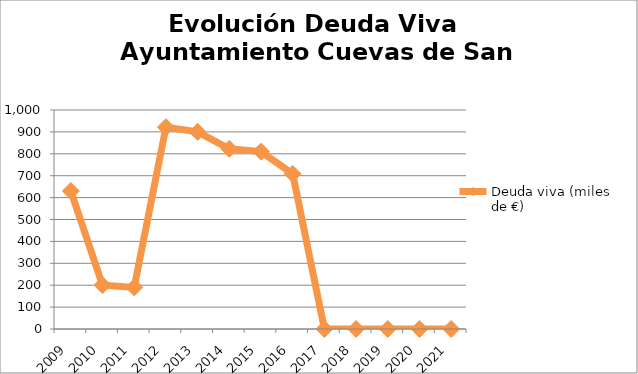
| Category | Deuda viva (miles de €) |
|---|---|
| 2009.0 | 630 |
| 2010.0 | 200 |
| 2011.0 | 190 |
| 2012.0 | 921.54 |
| 2013.0 | 900.247 |
| 2014.0 | 823.001 |
| 2015.0 | 810 |
| 2016.0 | 708.218 |
| 2017.0 | 0 |
| 2018.0 | 0 |
| 2019.0 | 0 |
| 2020.0 | 0 |
| 2021.0 | 0 |